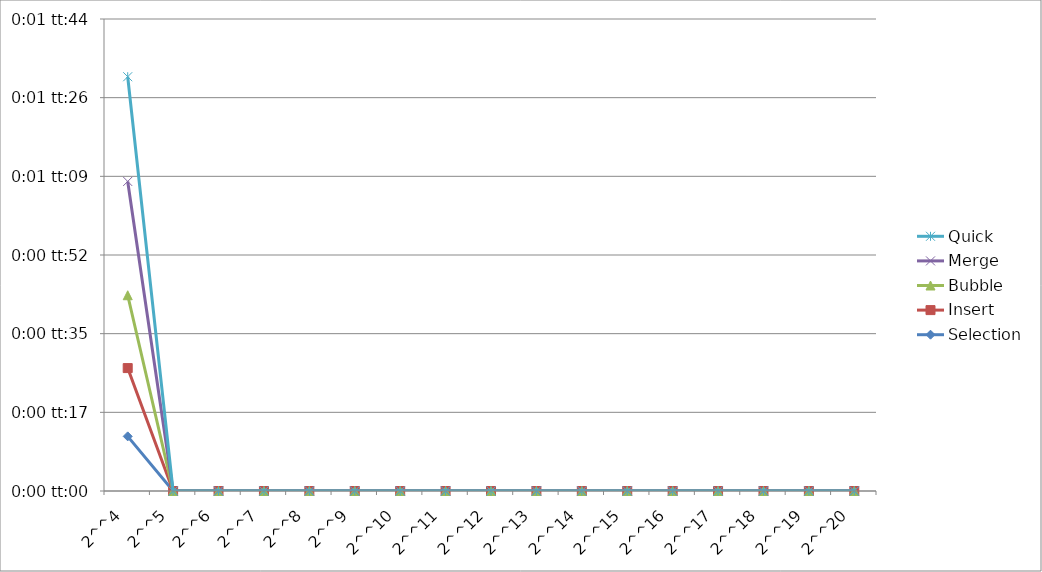
| Category | Selection | Insert | Bubble | Merge | Quick |
|---|---|---|---|---|---|
| 2^^4 | 0 | 0 | 0 | 0 | 0 |
| 2^^5 | 0 | 0 | 0 | 0 | 0 |
| 2^^6 | 0 | 0 | 0 | 0 | 0 |
| 2^^7 | 0 | 0 | 0 | 0 | 0 |
| 2^^8 | 0 | 0 | 0 | 0 | 0 |
| 2^^9 | 0 | 0 | 0 | 0 | 0 |
| 2^^10 | 0 | 0 | 0 | 0 | 0 |
| 2^^11 | 0 | 0 | 0 | 0 | 0 |
| 2^^12 | 0 | 0 | 0 | 0 | 0 |
| 2^^13 | 0 | 0 | 0 | 0 | 0 |
| 2^^14 | 0 | 0 | 0 | 0 | 0 |
| 2^^15 | 0 | 0 | 0 | 0 | 0 |
| 2^^16 | 0 | 0 | 0 | 0 | 0 |
| 2^^17 | 0 | 0 | 0 | 0 | 0 |
| 2^^18 | 0 | 0 | 0 | 0 | 0 |
| 2^^19 | 0 | 0 | 0 | 0 | 0 |
| 2^^20 | 0 | 0 | 0 | 0 | 0 |